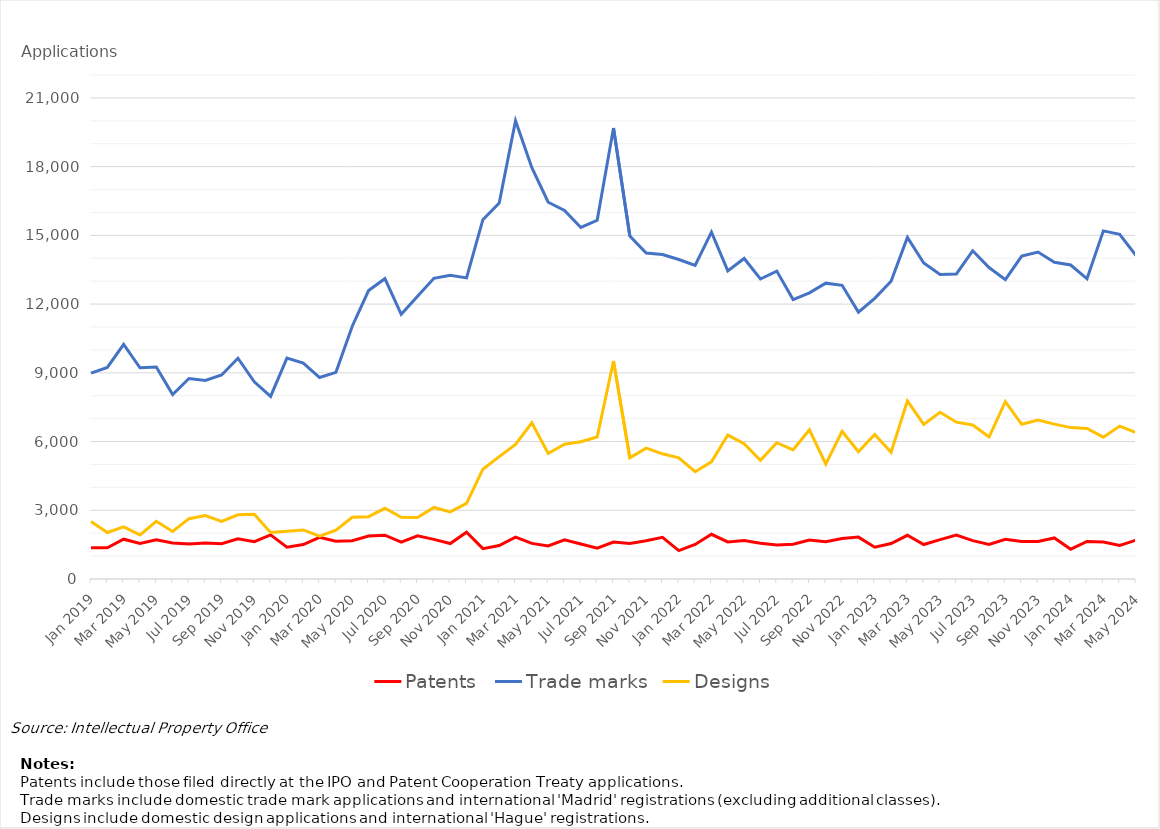
| Category | Patents | Trade marks | Designs |
|---|---|---|---|
| Jan 2019 | 1367 | 8985 | 2505 |
| Feb 2019 | 1361 | 9234 | 2031 |
| Mar 2019 | 1737 | 10243 | 2274 |
| Apr 2019 | 1552 | 9219 | 1923 |
| May 2019 | 1710 | 9251 | 2520 |
| Jun 2019 | 1569 | 8053 | 2074 |
| Jul 2019 | 1527 | 8752 | 2634 |
| Aug 2019 | 1570 | 8670 | 2768 |
| Sep 2019 | 1540 | 8908 | 2511 |
| Oct 2019 | 1755 | 9636 | 2800 |
| Nov 2019 | 1630 | 8607 | 2827 |
| Dec 2019 | 1927 | 7970 | 2028 |
| Jan 2020 | 1391 | 9642 | 2082 |
| Feb 2020 | 1504 | 9428 | 2143 |
| Mar 2020 | 1819 | 8794 | 1872 |
| Apr 2020 | 1648 | 9021 | 2127 |
| May 2020 | 1672 | 11035 | 2695 |
| Jun 2020 | 1879 | 12593 | 2721 |
| Jul 2020 | 1912 | 13110 | 3086 |
| Aug 2020 | 1613 | 11551 | 2695 |
| Sep 2020 | 1886 | 12340 | 2686 |
| Oct 2020 | 1730 | 13126 | 3124 |
| Nov 2020 | 1548 | 13254 | 2930 |
| Dec 2020 | 2042 | 13144 | 3302 |
| Jan 2021 | 1324 | 15685 | 4792 |
| Feb 2021 | 1462 | 16413 | 5340 |
| Mar 2021 | 1828 | 20001 | 5878 |
| Apr 2021 | 1554 | 17951 | 6815 |
| May 2021 | 1446 | 16446 | 5480 |
| Jun 2021 | 1712 | 16090 | 5881 |
| Jul 2021 | 1528 | 15347 | 5989 |
| Aug 2021 | 1344 | 15659 | 6200 |
| Sep 2021 | 1615 | 19685 | 9517 |
| Oct 2021 | 1547 | 14968 | 5292 |
| Nov 2021 | 1670 | 14232 | 5712 |
| Dec 2021 | 1817 | 14162 | 5464 |
| Jan 2022 | 1240 | 13945 | 5287 |
| Feb 2022 | 1505 | 13690 | 4683 |
| Mar 2022 | 1952 | 15142 | 5114 |
| Apr 2022 | 1616 | 13450 | 6282 |
| May 2022 | 1683 | 13992 | 5907 |
| Jun 2022 | 1562 | 13096 | 5183 |
| Jul 2022 | 1482 | 13439 | 5948 |
| Aug 2022 | 1519 | 12197 | 5639 |
| Sep 2022 | 1703 | 12493 | 6515 |
| Oct 2022 | 1628 | 12914 | 5013 |
| Nov 2022 | 1770 | 12819 | 6447 |
| Dec 2022 | 1828 | 11650 | 5558 |
| Jan 2023 | 1390 | 12250 | 6307 |
| Feb 2023 | 1550 | 13001 | 5528 |
| Mar 2023 | 1908 | 14909 | 7774 |
| Apr 2023 | 1504 | 13791 | 6745 |
| May 2023 | 1717 | 13291 | 7281 |
| Jun 2023 | 1920 | 13316 | 6845 |
| Jul 2023 | 1675 | 14328 | 6721 |
| Aug 2023 | 1507 | 13594 | 6196 |
| Sep 2023 | 1731 | 13064 | 7742 |
| Oct 2023 | 1641 | 14095 | 6752 |
| Nov 2023 | 1637 | 14270 | 6937 |
| Dec 2023 | 1792 | 13823 | 6761 |
| Jan 2024 | 1300 | 13707 | 6608 |
| Feb 2024 | 1640 | 13105 | 6568 |
| Mar 2024 | 1614 | 15196 | 6191 |
| April 2024 | 1461 | 15048 | 6675 |
| May 2024 | 1694 | 14120 | 6394 |